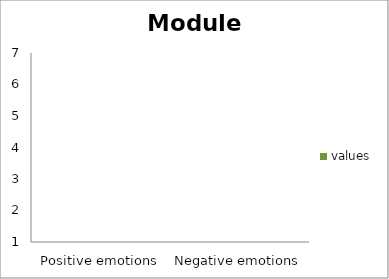
| Category | values |
|---|---|
| Positive emotions | 0 |
| Negative emotions | 0 |